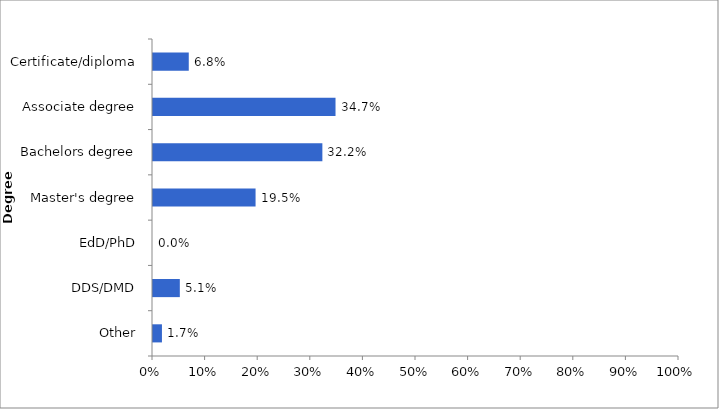
| Category | 2014-15 |
|---|---|
| Other | 0.017 |
| DDS/DMD | 0.051 |
| EdD/PhD | 0 |
| Master's degree | 0.195 |
| Bachelors degree | 0.322 |
| Associate degree | 0.347 |
| Certificate/diploma | 0.068 |